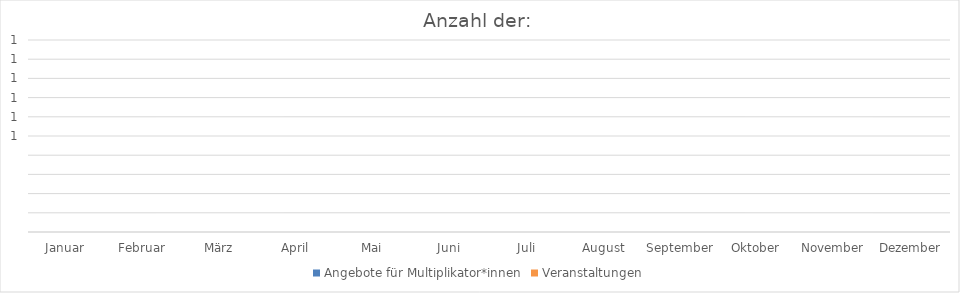
| Category | Angebote für Multiplikator*innen | Veranstaltungen |
|---|---|---|
| Januar | 0 | 0 |
| Februar | 0 | 0 |
| März | 0 | 0 |
| April | 0 | 0 |
| Mai | 0 | 0 |
| Juni | 0 | 0 |
| Juli | 0 | 0 |
| August | 0 | 0 |
| September | 0 | 0 |
| Oktober | 0 | 0 |
| November | 0 | 0 |
| Dezember | 0 | 0 |